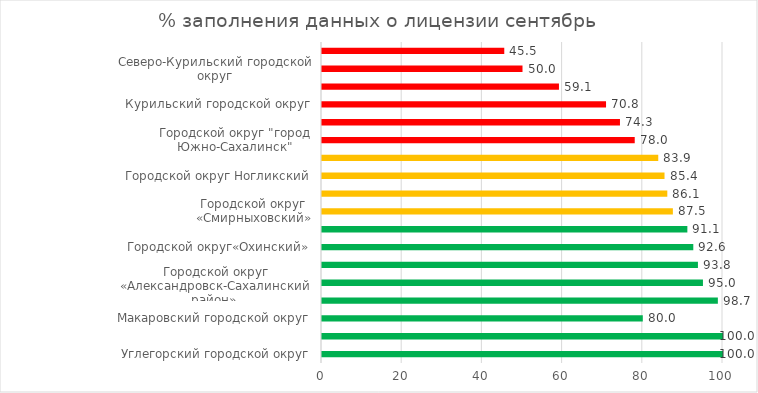
| Category | Series 0 |
|---|---|
| Углегорский городской округ | 100 |
| Невельский городской округ | 100 |
| Макаровский городской округ | 80 |
| Тымовский городской округ | 98.718 |
| Городской округ «Александровск-Сахалинский район»  | 95 |
| Южно-Курильский городской округ | 93.75 |
| Городской округ«Охинский» | 92.593 |
| Корсаковский городской округ | 91.111 |
| Городской округ «Смирныховский» | 87.5 |
| Томаринский городской округ | 86.111 |
| Городской округ Ногликский | 85.417 |
| Холмский городской округ | 83.854 |
| Городской округ "город Южно-Сахалинск" | 77.987 |
| Анивский городской округ | 74.306 |
| Курильский городской округ | 70.833 |
| Поронайский городской округ | 59.091 |
| Северо-Курильский городской округ | 50 |
| Городской округ «Долинский» | 45.455 |